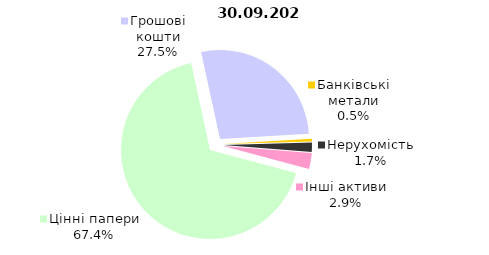
| Category | Всього |
|---|---|
| Цінні папери | 1430.447 |
| Грошові кошти | 582.86 |
| Банківські метали | 10.307 |
| Нерухомість | 36.037 |
| Інші активи | 61.754 |